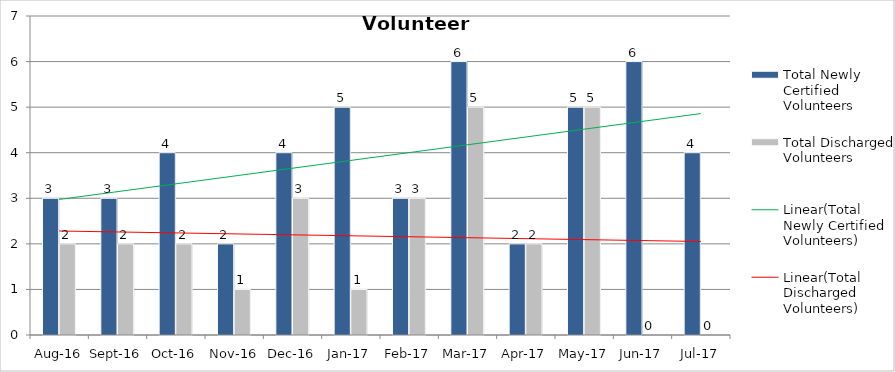
| Category | Total Newly Certified Volunteers | Total Discharged Volunteers |
|---|---|---|
| Aug-16 | 3 | 2 |
| Sep-16 | 3 | 2 |
| Oct-16 | 4 | 2 |
| Nov-16 | 2 | 1 |
| Dec-16 | 4 | 3 |
| Jan-17 | 5 | 1 |
| Feb-17 | 3 | 3 |
| Mar-17 | 6 | 5 |
| Apr-17 | 2 | 2 |
| May-17 | 5 | 5 |
| Jun-17 | 6 | 0 |
| Jul-17 | 4 | 0 |